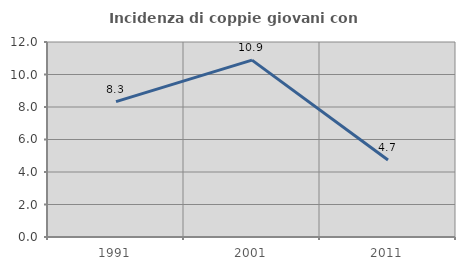
| Category | Incidenza di coppie giovani con figli |
|---|---|
| 1991.0 | 8.333 |
| 2001.0 | 10.884 |
| 2011.0 | 4.734 |